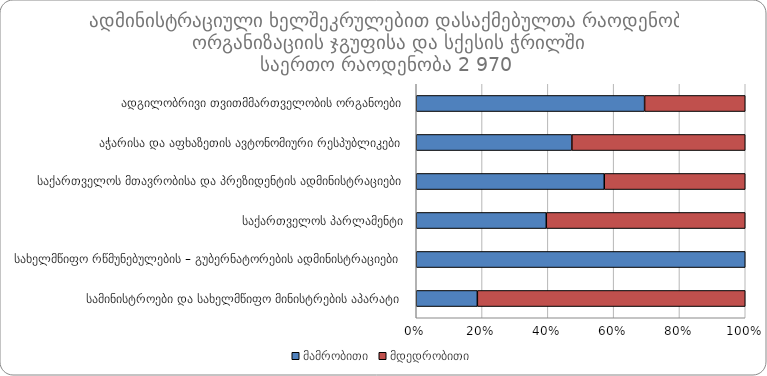
| Category | მამრობითი | მდედრობითი |
|---|---|---|
|  ადგილობრივი თვითმმართველობის ორგანოები | 1672 | 737 |
|  აჭარისა და აფხაზეთის ავტონომიური რესპუბლიკები | 35 | 39 |
|  საქართველოს მთავრობისა და პრეზიდენტის ადმინისტრაციები | 44 | 33 |
|  საქართველოს პარლამენტი | 134 | 205 |
|  სახელმწიფო რწმუნებულების – გუბერნატორების ადმინისტრაციები | 1 | 0 |
|  სამინისტროები და სახელმწიფო მინისტრების აპარატი | 13 | 57 |